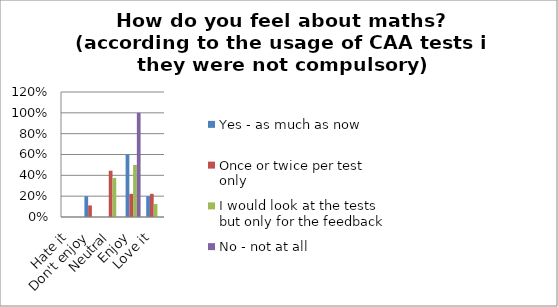
| Category | Yes - as much as now | Once or twice per test only | I would look at the tests but only for the feedback | No - not at all |
|---|---|---|---|---|
| Hate it | 0 | 0 | 0 | 0 |
| Don't enjoy | 0.2 | 0.111 | 0 | 0 |
| Neutral | 0 | 0.444 | 0.375 | 0 |
| Enjoy | 0.6 | 0.222 | 0.5 | 1 |
| Love it | 0.2 | 0.222 | 0.125 | 0 |